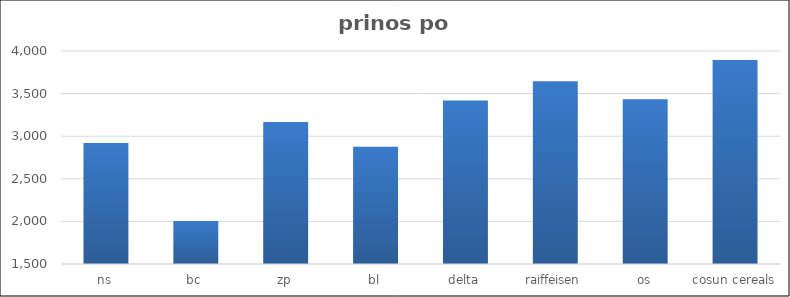
| Category | Series 0 |
|---|---|
| ns | 2919 |
| bc | 2006 |
| zp | 3166 |
| bl | 2876 |
| delta | 3419 |
| raiffeisen | 3644 |
| os | 3433 |
| cosun cereals | 3894 |